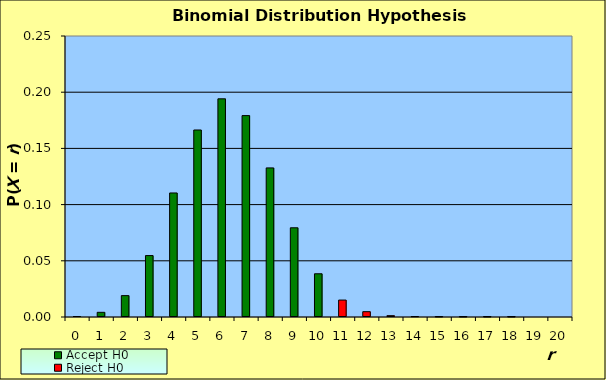
| Category | Accept H0 | Reject H0 |
|---|---|---|
| 0.0 | 0 | 0 |
| 1.0 | 0.004 | 0 |
| 2.0 | 0.019 | 0 |
| 3.0 | 0.055 | 0 |
| 4.0 | 0.11 | 0 |
| 5.0 | 0.166 | 0 |
| 6.0 | 0.194 | 0 |
| 7.0 | 0.179 | 0 |
| 8.0 | 0.133 | 0 |
| 9.0 | 0.079 | 0 |
| 10.0 | 0.038 | 0 |
| 11.0 | 0 | 0.015 |
| 12.0 | 0 | 0.005 |
| 13.0 | 0 | 0.001 |
| 14.0 | 0 | 0 |
| 15.0 | 0 | 0 |
| 16.0 | 0 | 0 |
| 17.0 | 0 | 0 |
| 18.0 | 0 | 0 |
| 19.0 | 0 | 0 |
| 20.0 | 0 | 0 |